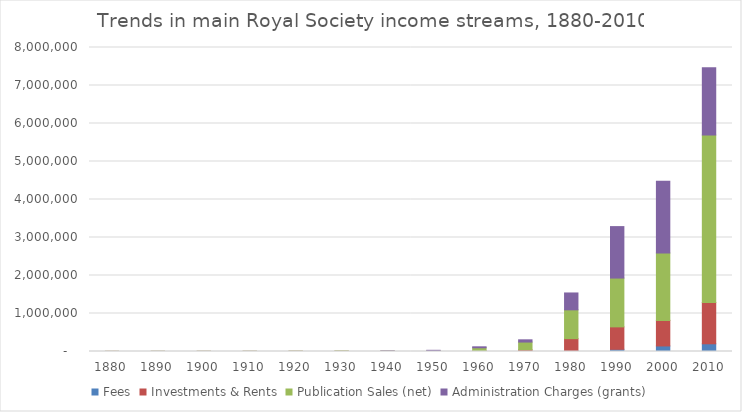
| Category | Fees | Investments & Rents | Publication Sales (net) | Administration Charges (grants) |
|---|---|---|---|---|
| 1880.0 | 1475 | 1934.379 | 789.575 | 0 |
| 1890.0 | 1526 | 3310.146 | 659.175 | 0 |
| 1900.0 | 1550 | 3339.783 | 708.3 | 0 |
| 1910.0 | 1727.246 | 3548.983 | 987.4 | 0 |
| 1920.0 | 1683.558 | 5088.746 | 1351.1 | 0 |
| 1930.0 | 2120 | 5752.842 | 5002.812 | 0 |
| 1940.0 | 2210 | 4524.579 | 5936.554 | 2317.033 |
| 1950.0 | 2530 | 5814.675 | 16414.054 | 6584.808 |
| 1960.0 | 3255 | 15854 | 79019 | 25341 |
| 1970.0 | 6340 | 38728 | 203362 | 58879 |
| 1980.0 | 16340 | 321817 | 758122 | 444193 |
| 1990.0 | 57849 | 590511 | 1284060 | 1354405 |
| 2000.0 | 146000 | 673000 | 1773000 | 1886000 |
| 2010.0 | 203000 | 1088000 | 4406000 | 1770000 |